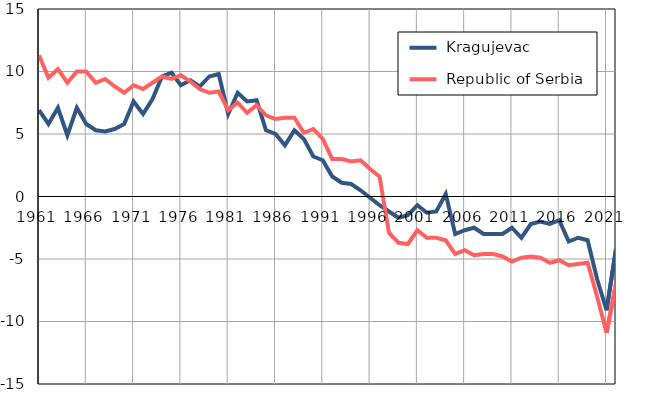
| Category |  Kragujevac |  Republic of Serbia |
|---|---|---|
| 1961.0 | 6.9 | 11.3 |
| 1962.0 | 5.8 | 9.5 |
| 1963.0 | 7.1 | 10.2 |
| 1964.0 | 4.9 | 9.1 |
| 1965.0 | 7.1 | 10 |
| 1966.0 | 5.8 | 10 |
| 1967.0 | 5.3 | 9.1 |
| 1968.0 | 5.2 | 9.4 |
| 1969.0 | 5.4 | 8.8 |
| 1970.0 | 5.8 | 8.3 |
| 1971.0 | 7.6 | 8.9 |
| 1972.0 | 6.6 | 8.6 |
| 1973.0 | 7.8 | 9.1 |
| 1974.0 | 9.6 | 9.6 |
| 1975.0 | 9.9 | 9.4 |
| 1976.0 | 8.9 | 9.7 |
| 1977.0 | 9.3 | 9.2 |
| 1978.0 | 8.8 | 8.6 |
| 1979.0 | 9.6 | 8.3 |
| 1980.0 | 9.8 | 8.4 |
| 1981.0 | 6.6 | 6.9 |
| 1982.0 | 8.3 | 7.5 |
| 1983.0 | 7.6 | 6.7 |
| 1984.0 | 7.7 | 7.3 |
| 1985.0 | 5.3 | 6.5 |
| 1986.0 | 5 | 6.2 |
| 1987.0 | 4.1 | 6.3 |
| 1988.0 | 5.3 | 6.3 |
| 1989.0 | 4.6 | 5.1 |
| 1990.0 | 3.2 | 5.4 |
| 1991.0 | 2.9 | 4.6 |
| 1992.0 | 1.6 | 3 |
| 1993.0 | 1.1 | 3 |
| 1994.0 | 1 | 2.8 |
| 1995.0 | 0.5 | 2.9 |
| 1996.0 | -0.1 | 2.2 |
| 1997.0 | -0.7 | 1.6 |
| 1998.0 | -1.2 | -2.9 |
| 1999.0 | -1.7 | -3.7 |
| 2000.0 | -1.5 | -3.8 |
| 2001.0 | -0.7 | -2.7 |
| 2002.0 | -1.3 | -3.3 |
| 2003.0 | -1.2 | -3.3 |
| 2004.0 | 0.2 | -3.5 |
| 2005.0 | -3 | -4.6 |
| 2006.0 | -2.7 | -4.3 |
| 2007.0 | -2.5 | -4.7 |
| 2008.0 | -3 | -4.6 |
| 2009.0 | -3 | -4.6 |
| 2010.0 | -3 | -4.8 |
| 2011.0 | -2.5 | -5.2 |
| 2012.0 | -3.3 | -4.9 |
| 2013.0 | -2.2 | -4.8 |
| 2014.0 | -2 | -4.9 |
| 2015.0 | -2.2 | -5.3 |
| 2016.0 | -1.9 | -5.1 |
| 2017.0 | -3.6 | -5.5 |
| 2018.0 | -3.3 | -5.4 |
| 2019.0 | -3.5 | -5.3 |
| 2020.0 | -6.6 | -8 |
| 2021.0 | -9.1 | -10.9 |
| 2022.0 | -4.2 | -7 |